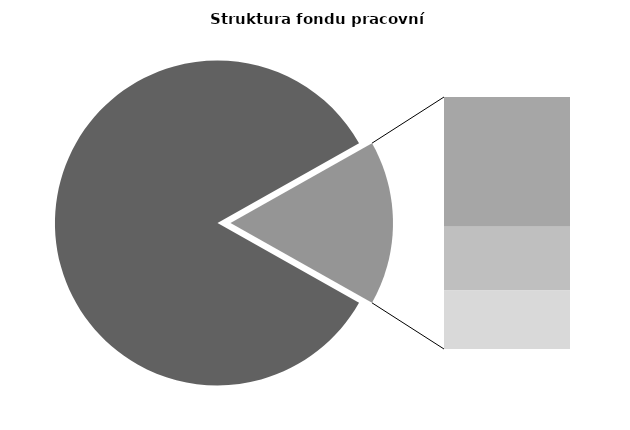
| Category | Series 0 |
|---|---|
| Průměrná měsíční odpracovaná doba bez přesčasu | 141.658 |
| Dovolená | 14.247 |
| Nemoc | 7.004 |
| Jiné | 6.44 |